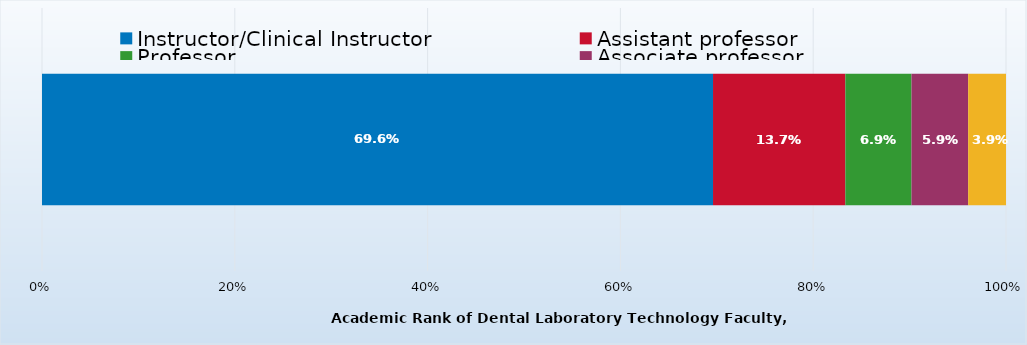
| Category | Instructor/Clinical Instructor | Assistant professor | Professor | Associate professor | Lab technician/Lab associate |
|---|---|---|---|---|---|
| 0 | 0.696 | 0.137 | 0.069 | 0.059 | 0.039 |